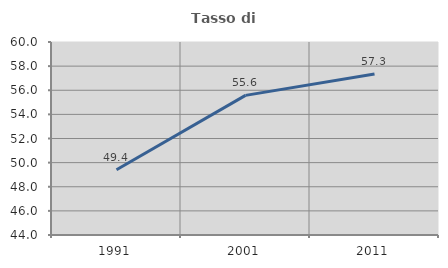
| Category | Tasso di occupazione   |
|---|---|
| 1991.0 | 49.404 |
| 2001.0 | 55.574 |
| 2011.0 | 57.345 |